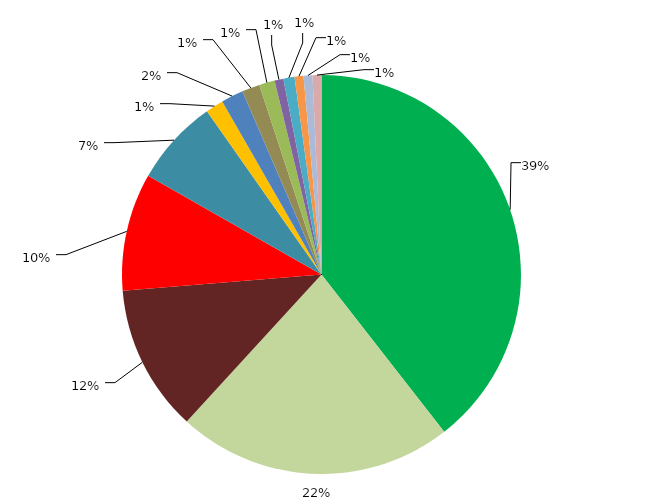
| Category | Series 0 |
|---|---|
| SP | 0.384 |
| MS | 0.217 |
| PR | 0.116 |
| RS | 0.093 |
| MG | 0.068 |
| SC | 0.014 |
| RJ | 0.018 |
| GO | 0.014 |
| BA | 0.012 |
| CE | 0.007 |
| MT | 0.009 |
| ES | 0.007 |
| PA | 0.007 |
| PE | 0.007 |